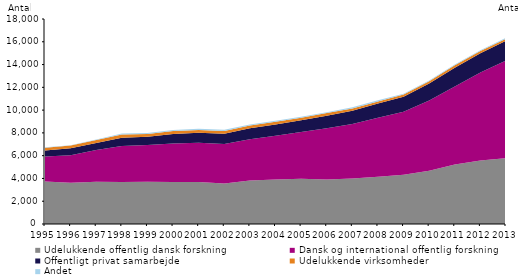
| Category | Udelukkende offentlig dansk forskning | Dansk og international offentlig forskning | Offentligt privat samarbejde | Udelukkende virksomheder | Andet |
|---|---|---|---|---|---|
| 1995.0 | 3731 | 2201 | 523 | 244 | 39 |
| 1996.0 | 3631 | 2397 | 624 | 237 | 34 |
| 1997.0 | 3717 | 2777 | 626 | 251 | 57 |
| 1998.0 | 3697 | 3155 | 732 | 283 | 69 |
| 1999.0 | 3713 | 3220 | 720 | 250 | 88 |
| 2000.0 | 3685 | 3390 | 820 | 262 | 93 |
| 2001.0 | 3695 | 3439 | 880 | 246 | 98 |
| 2002.0 | 3560 | 3464 | 898 | 249 | 114 |
| 2003.0 | 3811 | 3639 | 950 | 251 | 77 |
| 2004.0 | 3907 | 3836 | 990 | 245 | 97 |
| 2005.0 | 3975 | 4105 | 1030 | 221 | 92 |
| 2006.0 | 3905 | 4511 | 1099 | 232 | 67 |
| 2007.0 | 3986 | 4798 | 1152 | 216 | 95 |
| 2008.0 | 4156 | 5176 | 1240 | 184 | 100 |
| 2009.0 | 4317 | 5550 | 1296 | 215 | 63 |
| 2010.0 | 4679 | 6160 | 1503 | 197 | 60 |
| 2011.0 | 5214 | 6858 | 1650 | 217 | 68 |
| 2012.0 | 5567 | 7727 | 1704 | 184 | 71 |
| 2013.0 | 5790 | 8565 | 1723 | 178 | 95 |